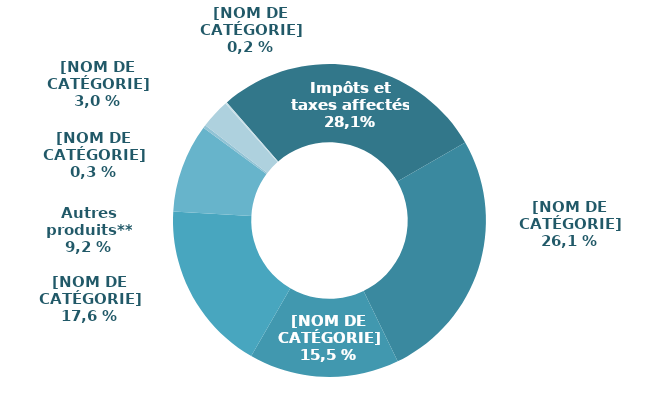
| Category | Series 0 |
|---|---|
| ITAF | 0.281 |
| Contributions du Régime général | 0.261 |
| Compensation démographique | 0.155 |
| Cotisations sociales | 0.176 |
| Autres produits** | 0.092 |
| Prise en charge de prestations* | 0.003 |
| Contribution sociale généralisée | 0.03 |
| Cotisations prises en charge par l'Etat | 0.002 |